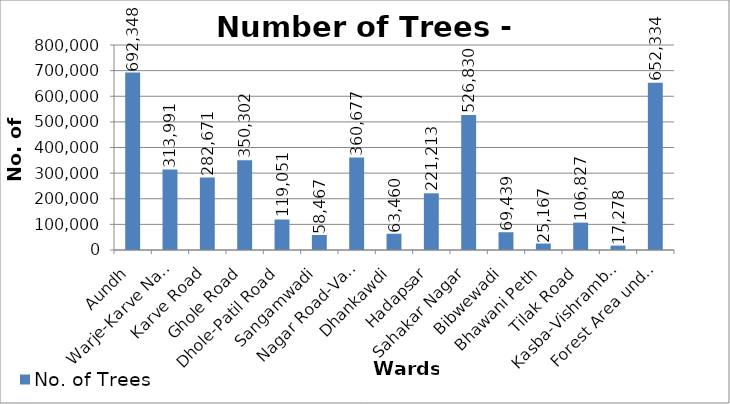
| Category | No. of Trees |
|---|---|
| Aundh | 692348 |
| Warje-Karve Nagar | 313991 |
| Karve Road | 282671 |
| Ghole Road | 350302 |
| Dhole-Patil Road | 119051 |
| Sangamwadi | 58467 |
| Nagar Road-Vadgaon Sheri | 360677 |
| Dhankawdi | 63460 |
| Hadapsar | 221213 |
| Sahakar Nagar | 526830 |
| Bibwewadi | 69439 |
| Bhawani Peth | 25167 |
| Tilak Road | 106827 |
| Kasba-Vishrambaugwada | 17278 |
| Forest Area under PMC | 652334 |